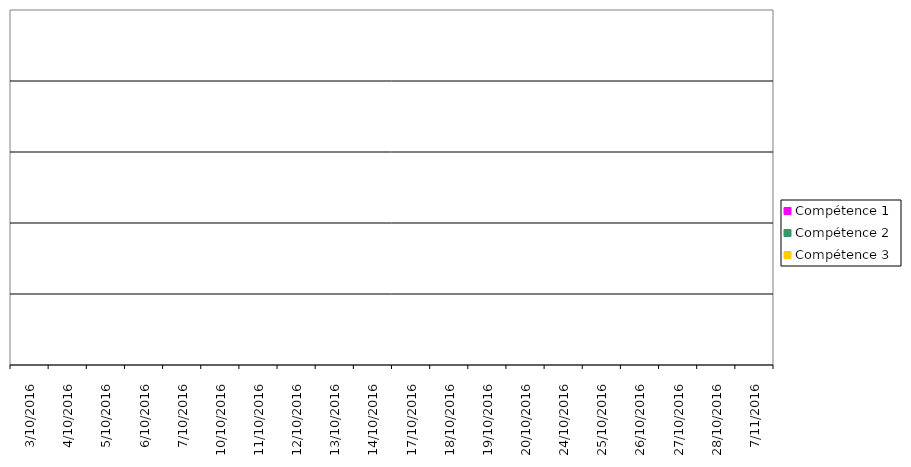
| Category | Compétence 1 | Compétence 2 | Compétence 3 |
|---|---|---|---|
| 3-10-2016 | 0 | 0 | 0 |
| 4-10-2016 | 0 | 0 | 0 |
| 5-10-2016 | 0 | 0 | 0 |
| 6-10-2016 | 0 | 0 | 0 |
| 7-10-2016 | 0 | 0 | 0 |
| 10-10-2016 | 0 | 0 | 0 |
| 11-10-2016 | 0 | 0 | 0 |
| 12-10-2016 | 0 | 0 | 0 |
| 13-10-2016 | 0 | 0 | 0 |
| 14-10-2016 | 0 | 0 | 0 |
| 17-10-2016 | 0 | 0 | 0 |
| 18-10-2016 | 0 | 0 | 0 |
| 19-10-2016 | 0 | 0 | 0 |
| 20-10-2016 | 0 | 0 | 0 |
| 24-10-2016 | 0 | 0 | 0 |
| 25-10-2016 | 0 | 0 | 0 |
| 26-10-2016 | 0 | 0 | 0 |
| 27-10-2016 | 0 | 0 | 0 |
| 28-10-2016 | 0 | 0 | 0 |
| 7-11-2016 | 0 | 0 | 0 |